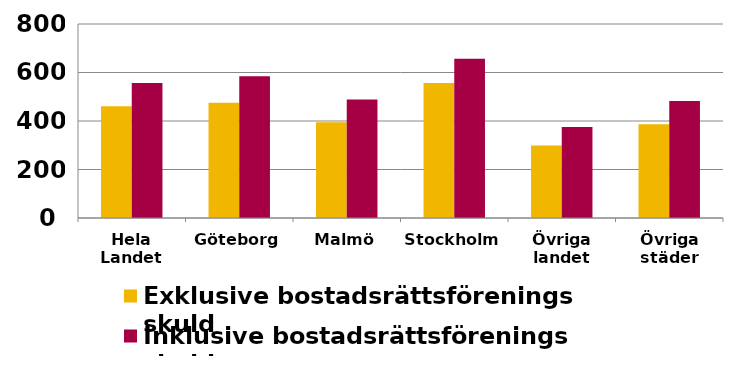
| Category | Exklusive bostadsrättsförenings skuld | Inklusive bostadsrättsförenings skuld |
|---|---|---|
| Hela Landet | 460.428 | 556.485 |
| Göteborg | 474.992 | 584.496 |
| Malmö | 395.09 | 488.183 |
| Stockholm | 556.8 | 656.39 |
| Övriga landet | 298.789 | 375.634 |
| Övriga städer | 386.458 | 482.828 |